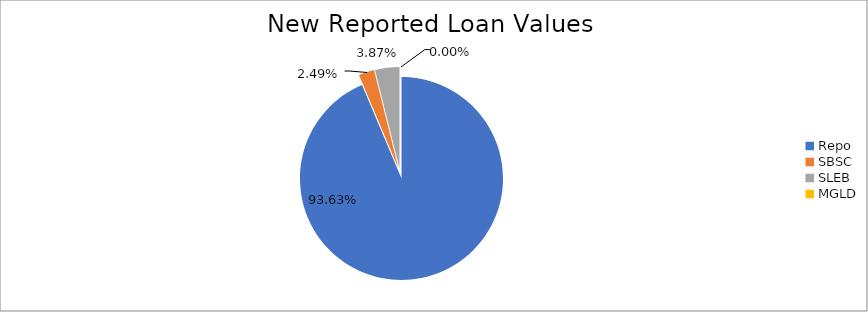
| Category | Series 0 |
|---|---|
| Repo | 9580684.847 |
| SBSC | 254590.292 |
| SLEB | 396446.245 |
| MGLD | 359.208 |